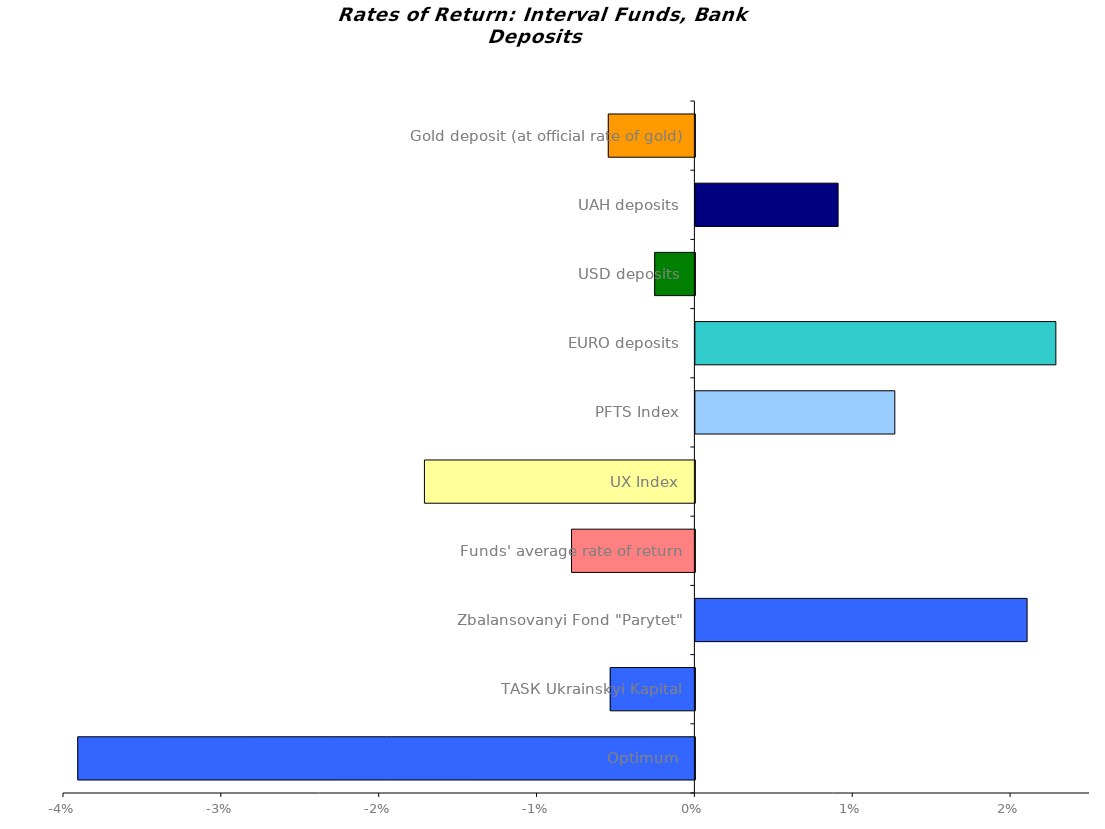
| Category | Series 0 |
|---|---|
| Optimum | -0.039 |
| ТАSК Ukrainskyi Kapital | -0.005 |
| Zbalansovanyi Fond "Parytet" | 0.021 |
| Funds' average rate of return | -0.008 |
| UX Index | -0.017 |
| PFTS Index | 0.013 |
| EURO deposits | 0.023 |
| USD deposits | -0.003 |
| UAH deposits | 0.009 |
| Gold deposit (at official rate of gold) | -0.005 |